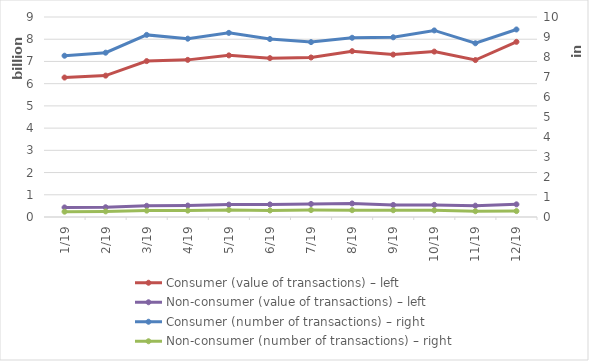
| Category | Consumer (value of transactions) – left | Non-consumer (value of transactions) – left |
|---|---|---|
| 2019-01-01 | 6275899917 | 429978871 |
| 2019-02-01 | 6362058436 | 439206083 |
| 2019-03-01 | 7015376109 | 503371811 |
| 2019-04-01 | 7071002942 | 514903927 |
| 2019-05-01 | 7273046006 | 557295821 |
| 2019-06-01 | 7149231768 | 565926000 |
| 2019-07-01 | 7178062210 | 587315171 |
| 2019-08-01 | 7462486991 | 608748949 |
| 2019-09-01 | 7308487837 | 542667140 |
| 2019-10-01 | 7443204522 | 545582562 |
| 2019-11-01 | 7062691220 | 510200494 |
| 2019-12-01 | 7883134692 | 569639509 |